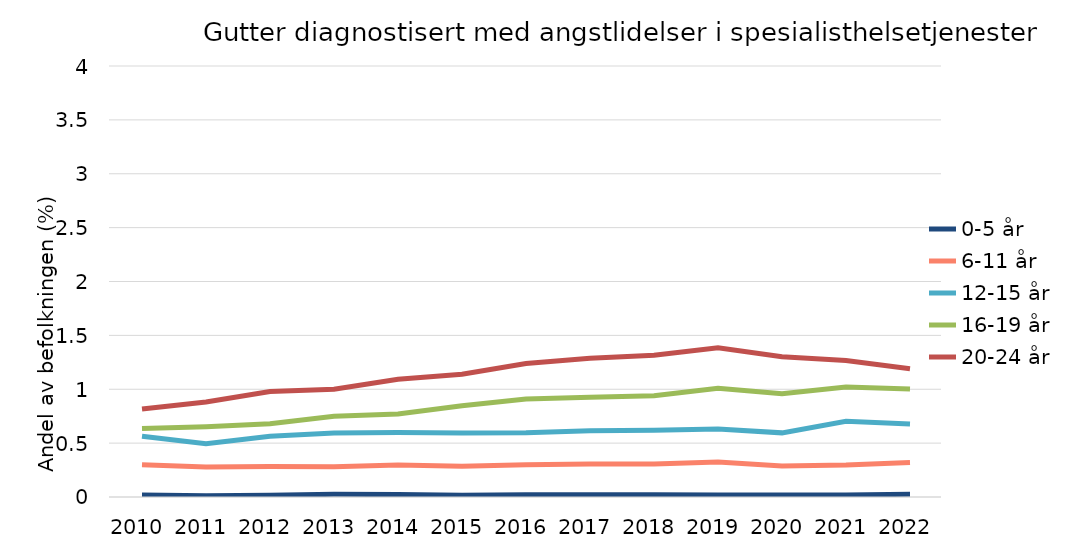
| Category | 0-5 år | 6-11 år | 12-15 år | 16-19 år | 20-24 år |
|---|---|---|---|---|---|
| 2010.0 | 0.018 | 0.299 | 0.564 | 0.636 | 0.817 |
| 2011.0 | 0.013 | 0.278 | 0.495 | 0.653 | 0.883 |
| 2012.0 | 0.016 | 0.282 | 0.564 | 0.681 | 0.979 |
| 2013.0 | 0.024 | 0.28 | 0.595 | 0.749 | 1.001 |
| 2014.0 | 0.022 | 0.298 | 0.6 | 0.771 | 1.093 |
| 2015.0 | 0.017 | 0.285 | 0.594 | 0.848 | 1.14 |
| 2016.0 | 0.022 | 0.3 | 0.596 | 0.91 | 1.238 |
| 2017.0 | 0.022 | 0.306 | 0.616 | 0.926 | 1.287 |
| 2018.0 | 0.02 | 0.305 | 0.619 | 0.94 | 1.315 |
| 2019.0 | 0.019 | 0.325 | 0.631 | 1.01 | 1.385 |
| 2020.0 | 0.018 | 0.287 | 0.595 | 0.958 | 1.301 |
| 2021.0 | 0.019 | 0.297 | 0.702 | 1.022 | 1.266 |
| 2022.0 | 0.025 | 0.321 | 0.678 | 1.003 | 1.191 |